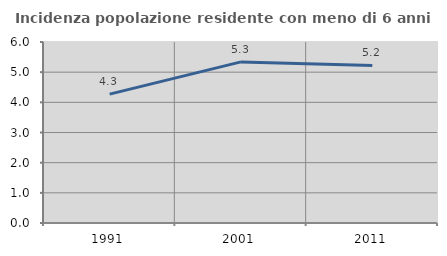
| Category | Incidenza popolazione residente con meno di 6 anni |
|---|---|
| 1991.0 | 4.272 |
| 2001.0 | 5.34 |
| 2011.0 | 5.222 |